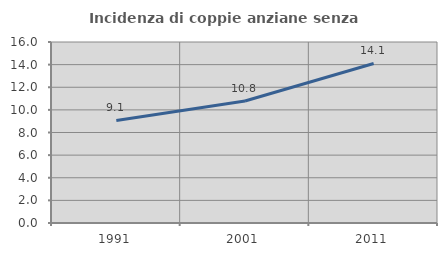
| Category | Incidenza di coppie anziane senza figli  |
|---|---|
| 1991.0 | 9.067 |
| 2001.0 | 10.78 |
| 2011.0 | 14.1 |